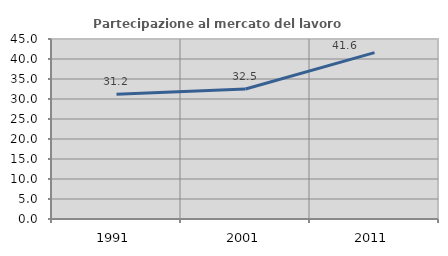
| Category | Partecipazione al mercato del lavoro  femminile |
|---|---|
| 1991.0 | 31.169 |
| 2001.0 | 32.5 |
| 2011.0 | 41.593 |